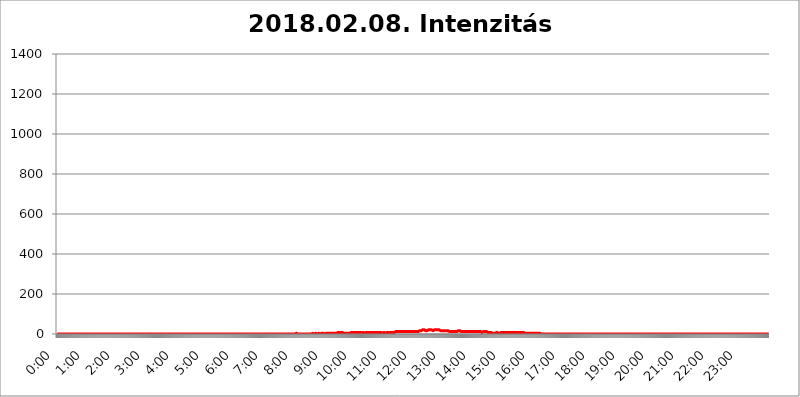
| Category | 2018.02.08. Intenzitás [W/m^2] |
|---|---|
| 0.0 | 0 |
| 0.0006944444444444445 | 0 |
| 0.001388888888888889 | 0 |
| 0.0020833333333333333 | 0 |
| 0.002777777777777778 | 0 |
| 0.003472222222222222 | 0 |
| 0.004166666666666667 | 0 |
| 0.004861111111111111 | 0 |
| 0.005555555555555556 | 0 |
| 0.0062499999999999995 | 0 |
| 0.006944444444444444 | 0 |
| 0.007638888888888889 | 0 |
| 0.008333333333333333 | 0 |
| 0.009027777777777779 | 0 |
| 0.009722222222222222 | 0 |
| 0.010416666666666666 | 0 |
| 0.011111111111111112 | 0 |
| 0.011805555555555555 | 0 |
| 0.012499999999999999 | 0 |
| 0.013194444444444444 | 0 |
| 0.013888888888888888 | 0 |
| 0.014583333333333332 | 0 |
| 0.015277777777777777 | 0 |
| 0.015972222222222224 | 0 |
| 0.016666666666666666 | 0 |
| 0.017361111111111112 | 0 |
| 0.018055555555555557 | 0 |
| 0.01875 | 0 |
| 0.019444444444444445 | 0 |
| 0.02013888888888889 | 0 |
| 0.020833333333333332 | 0 |
| 0.02152777777777778 | 0 |
| 0.022222222222222223 | 0 |
| 0.02291666666666667 | 0 |
| 0.02361111111111111 | 0 |
| 0.024305555555555556 | 0 |
| 0.024999999999999998 | 0 |
| 0.025694444444444447 | 0 |
| 0.02638888888888889 | 0 |
| 0.027083333333333334 | 0 |
| 0.027777777777777776 | 0 |
| 0.02847222222222222 | 0 |
| 0.029166666666666664 | 0 |
| 0.029861111111111113 | 0 |
| 0.030555555555555555 | 0 |
| 0.03125 | 0 |
| 0.03194444444444445 | 0 |
| 0.03263888888888889 | 0 |
| 0.03333333333333333 | 0 |
| 0.034027777777777775 | 0 |
| 0.034722222222222224 | 0 |
| 0.035416666666666666 | 0 |
| 0.036111111111111115 | 0 |
| 0.03680555555555556 | 0 |
| 0.0375 | 0 |
| 0.03819444444444444 | 0 |
| 0.03888888888888889 | 0 |
| 0.03958333333333333 | 0 |
| 0.04027777777777778 | 0 |
| 0.04097222222222222 | 0 |
| 0.041666666666666664 | 0 |
| 0.042361111111111106 | 0 |
| 0.04305555555555556 | 0 |
| 0.043750000000000004 | 0 |
| 0.044444444444444446 | 0 |
| 0.04513888888888889 | 0 |
| 0.04583333333333334 | 0 |
| 0.04652777777777778 | 0 |
| 0.04722222222222222 | 0 |
| 0.04791666666666666 | 0 |
| 0.04861111111111111 | 0 |
| 0.049305555555555554 | 0 |
| 0.049999999999999996 | 0 |
| 0.05069444444444445 | 0 |
| 0.051388888888888894 | 0 |
| 0.052083333333333336 | 0 |
| 0.05277777777777778 | 0 |
| 0.05347222222222222 | 0 |
| 0.05416666666666667 | 0 |
| 0.05486111111111111 | 0 |
| 0.05555555555555555 | 0 |
| 0.05625 | 0 |
| 0.05694444444444444 | 0 |
| 0.057638888888888885 | 0 |
| 0.05833333333333333 | 0 |
| 0.05902777777777778 | 0 |
| 0.059722222222222225 | 0 |
| 0.06041666666666667 | 0 |
| 0.061111111111111116 | 0 |
| 0.06180555555555556 | 0 |
| 0.0625 | 0 |
| 0.06319444444444444 | 0 |
| 0.06388888888888888 | 0 |
| 0.06458333333333334 | 0 |
| 0.06527777777777778 | 0 |
| 0.06597222222222222 | 0 |
| 0.06666666666666667 | 0 |
| 0.06736111111111111 | 0 |
| 0.06805555555555555 | 0 |
| 0.06874999999999999 | 0 |
| 0.06944444444444443 | 0 |
| 0.07013888888888889 | 0 |
| 0.07083333333333333 | 0 |
| 0.07152777777777779 | 0 |
| 0.07222222222222223 | 0 |
| 0.07291666666666667 | 0 |
| 0.07361111111111111 | 0 |
| 0.07430555555555556 | 0 |
| 0.075 | 0 |
| 0.07569444444444444 | 0 |
| 0.0763888888888889 | 0 |
| 0.07708333333333334 | 0 |
| 0.07777777777777778 | 0 |
| 0.07847222222222222 | 0 |
| 0.07916666666666666 | 0 |
| 0.0798611111111111 | 0 |
| 0.08055555555555556 | 0 |
| 0.08125 | 0 |
| 0.08194444444444444 | 0 |
| 0.08263888888888889 | 0 |
| 0.08333333333333333 | 0 |
| 0.08402777777777777 | 0 |
| 0.08472222222222221 | 0 |
| 0.08541666666666665 | 0 |
| 0.08611111111111112 | 0 |
| 0.08680555555555557 | 0 |
| 0.08750000000000001 | 0 |
| 0.08819444444444445 | 0 |
| 0.08888888888888889 | 0 |
| 0.08958333333333333 | 0 |
| 0.09027777777777778 | 0 |
| 0.09097222222222222 | 0 |
| 0.09166666666666667 | 0 |
| 0.09236111111111112 | 0 |
| 0.09305555555555556 | 0 |
| 0.09375 | 0 |
| 0.09444444444444444 | 0 |
| 0.09513888888888888 | 0 |
| 0.09583333333333333 | 0 |
| 0.09652777777777777 | 0 |
| 0.09722222222222222 | 0 |
| 0.09791666666666667 | 0 |
| 0.09861111111111111 | 0 |
| 0.09930555555555555 | 0 |
| 0.09999999999999999 | 0 |
| 0.10069444444444443 | 0 |
| 0.1013888888888889 | 0 |
| 0.10208333333333335 | 0 |
| 0.10277777777777779 | 0 |
| 0.10347222222222223 | 0 |
| 0.10416666666666667 | 0 |
| 0.10486111111111111 | 0 |
| 0.10555555555555556 | 0 |
| 0.10625 | 0 |
| 0.10694444444444444 | 0 |
| 0.1076388888888889 | 0 |
| 0.10833333333333334 | 0 |
| 0.10902777777777778 | 0 |
| 0.10972222222222222 | 0 |
| 0.1111111111111111 | 0 |
| 0.11180555555555556 | 0 |
| 0.11180555555555556 | 0 |
| 0.1125 | 0 |
| 0.11319444444444444 | 0 |
| 0.11388888888888889 | 0 |
| 0.11458333333333333 | 0 |
| 0.11527777777777777 | 0 |
| 0.11597222222222221 | 0 |
| 0.11666666666666665 | 0 |
| 0.1173611111111111 | 0 |
| 0.11805555555555557 | 0 |
| 0.11944444444444445 | 0 |
| 0.12013888888888889 | 0 |
| 0.12083333333333333 | 0 |
| 0.12152777777777778 | 0 |
| 0.12222222222222223 | 0 |
| 0.12291666666666667 | 0 |
| 0.12291666666666667 | 0 |
| 0.12361111111111112 | 0 |
| 0.12430555555555556 | 0 |
| 0.125 | 0 |
| 0.12569444444444444 | 0 |
| 0.12638888888888888 | 0 |
| 0.12708333333333333 | 0 |
| 0.16875 | 0 |
| 0.12847222222222224 | 0 |
| 0.12916666666666668 | 0 |
| 0.12986111111111112 | 0 |
| 0.13055555555555556 | 0 |
| 0.13125 | 0 |
| 0.13194444444444445 | 0 |
| 0.1326388888888889 | 0 |
| 0.13333333333333333 | 0 |
| 0.13402777777777777 | 0 |
| 0.13402777777777777 | 0 |
| 0.13472222222222222 | 0 |
| 0.13541666666666666 | 0 |
| 0.1361111111111111 | 0 |
| 0.13749999999999998 | 0 |
| 0.13819444444444443 | 0 |
| 0.1388888888888889 | 0 |
| 0.13958333333333334 | 0 |
| 0.14027777777777778 | 0 |
| 0.14097222222222222 | 0 |
| 0.14166666666666666 | 0 |
| 0.1423611111111111 | 0 |
| 0.14305555555555557 | 0 |
| 0.14375000000000002 | 0 |
| 0.14444444444444446 | 0 |
| 0.1451388888888889 | 0 |
| 0.1451388888888889 | 0 |
| 0.14652777777777778 | 0 |
| 0.14722222222222223 | 0 |
| 0.14791666666666667 | 0 |
| 0.1486111111111111 | 0 |
| 0.14930555555555555 | 0 |
| 0.15 | 0 |
| 0.15069444444444444 | 0 |
| 0.15138888888888888 | 0 |
| 0.15208333333333332 | 0 |
| 0.15277777777777776 | 0 |
| 0.15347222222222223 | 0 |
| 0.15416666666666667 | 0 |
| 0.15486111111111112 | 0 |
| 0.15555555555555556 | 0 |
| 0.15625 | 0 |
| 0.15694444444444444 | 0 |
| 0.15763888888888888 | 0 |
| 0.15833333333333333 | 0 |
| 0.15902777777777777 | 0 |
| 0.15972222222222224 | 0 |
| 0.16041666666666668 | 0 |
| 0.16111111111111112 | 0 |
| 0.16180555555555556 | 0 |
| 0.1625 | 0 |
| 0.16319444444444445 | 0 |
| 0.1638888888888889 | 0 |
| 0.16458333333333333 | 0 |
| 0.16527777777777777 | 0 |
| 0.16597222222222222 | 0 |
| 0.16666666666666666 | 0 |
| 0.1673611111111111 | 0 |
| 0.16805555555555554 | 0 |
| 0.16874999999999998 | 0 |
| 0.16944444444444443 | 0 |
| 0.17013888888888887 | 0 |
| 0.1708333333333333 | 0 |
| 0.17152777777777775 | 0 |
| 0.17222222222222225 | 0 |
| 0.1729166666666667 | 0 |
| 0.17361111111111113 | 0 |
| 0.17430555555555557 | 0 |
| 0.17500000000000002 | 0 |
| 0.17569444444444446 | 0 |
| 0.1763888888888889 | 0 |
| 0.17708333333333334 | 0 |
| 0.17777777777777778 | 0 |
| 0.17847222222222223 | 0 |
| 0.17916666666666667 | 0 |
| 0.1798611111111111 | 0 |
| 0.18055555555555555 | 0 |
| 0.18125 | 0 |
| 0.18194444444444444 | 0 |
| 0.1826388888888889 | 0 |
| 0.18333333333333335 | 0 |
| 0.1840277777777778 | 0 |
| 0.18472222222222223 | 0 |
| 0.18541666666666667 | 0 |
| 0.18611111111111112 | 0 |
| 0.18680555555555556 | 0 |
| 0.1875 | 0 |
| 0.18819444444444444 | 0 |
| 0.18888888888888888 | 0 |
| 0.18958333333333333 | 0 |
| 0.19027777777777777 | 0 |
| 0.1909722222222222 | 0 |
| 0.19166666666666665 | 0 |
| 0.19236111111111112 | 0 |
| 0.19305555555555554 | 0 |
| 0.19375 | 0 |
| 0.19444444444444445 | 0 |
| 0.1951388888888889 | 0 |
| 0.19583333333333333 | 0 |
| 0.19652777777777777 | 0 |
| 0.19722222222222222 | 0 |
| 0.19791666666666666 | 0 |
| 0.1986111111111111 | 0 |
| 0.19930555555555554 | 0 |
| 0.19999999999999998 | 0 |
| 0.20069444444444443 | 0 |
| 0.20138888888888887 | 0 |
| 0.2020833333333333 | 0 |
| 0.2027777777777778 | 0 |
| 0.2034722222222222 | 0 |
| 0.2041666666666667 | 0 |
| 0.20486111111111113 | 0 |
| 0.20555555555555557 | 0 |
| 0.20625000000000002 | 0 |
| 0.20694444444444446 | 0 |
| 0.2076388888888889 | 0 |
| 0.20833333333333334 | 0 |
| 0.20902777777777778 | 0 |
| 0.20972222222222223 | 0 |
| 0.21041666666666667 | 0 |
| 0.2111111111111111 | 0 |
| 0.21180555555555555 | 0 |
| 0.2125 | 0 |
| 0.21319444444444444 | 0 |
| 0.2138888888888889 | 0 |
| 0.21458333333333335 | 0 |
| 0.2152777777777778 | 0 |
| 0.21597222222222223 | 0 |
| 0.21666666666666667 | 0 |
| 0.21736111111111112 | 0 |
| 0.21805555555555556 | 0 |
| 0.21875 | 0 |
| 0.21944444444444444 | 0 |
| 0.22013888888888888 | 0 |
| 0.22083333333333333 | 0 |
| 0.22152777777777777 | 0 |
| 0.2222222222222222 | 0 |
| 0.22291666666666665 | 0 |
| 0.2236111111111111 | 0 |
| 0.22430555555555556 | 0 |
| 0.225 | 0 |
| 0.22569444444444445 | 0 |
| 0.2263888888888889 | 0 |
| 0.22708333333333333 | 0 |
| 0.22777777777777777 | 0 |
| 0.22847222222222222 | 0 |
| 0.22916666666666666 | 0 |
| 0.2298611111111111 | 0 |
| 0.23055555555555554 | 0 |
| 0.23124999999999998 | 0 |
| 0.23194444444444443 | 0 |
| 0.23263888888888887 | 0 |
| 0.2333333333333333 | 0 |
| 0.2340277777777778 | 0 |
| 0.2347222222222222 | 0 |
| 0.2354166666666667 | 0 |
| 0.23611111111111113 | 0 |
| 0.23680555555555557 | 0 |
| 0.23750000000000002 | 0 |
| 0.23819444444444446 | 0 |
| 0.2388888888888889 | 0 |
| 0.23958333333333334 | 0 |
| 0.24027777777777778 | 0 |
| 0.24097222222222223 | 0 |
| 0.24166666666666667 | 0 |
| 0.2423611111111111 | 0 |
| 0.24305555555555555 | 0 |
| 0.24375 | 0 |
| 0.24444444444444446 | 0 |
| 0.24513888888888888 | 0 |
| 0.24583333333333335 | 0 |
| 0.2465277777777778 | 0 |
| 0.24722222222222223 | 0 |
| 0.24791666666666667 | 0 |
| 0.24861111111111112 | 0 |
| 0.24930555555555556 | 0 |
| 0.25 | 0 |
| 0.25069444444444444 | 0 |
| 0.2513888888888889 | 0 |
| 0.2520833333333333 | 0 |
| 0.25277777777777777 | 0 |
| 0.2534722222222222 | 0 |
| 0.25416666666666665 | 0 |
| 0.2548611111111111 | 0 |
| 0.2555555555555556 | 0 |
| 0.25625000000000003 | 0 |
| 0.2569444444444445 | 0 |
| 0.2576388888888889 | 0 |
| 0.25833333333333336 | 0 |
| 0.2590277777777778 | 0 |
| 0.25972222222222224 | 0 |
| 0.2604166666666667 | 0 |
| 0.2611111111111111 | 0 |
| 0.26180555555555557 | 0 |
| 0.2625 | 0 |
| 0.26319444444444445 | 0 |
| 0.2638888888888889 | 0 |
| 0.26458333333333334 | 0 |
| 0.2652777777777778 | 0 |
| 0.2659722222222222 | 0 |
| 0.26666666666666666 | 0 |
| 0.2673611111111111 | 0 |
| 0.26805555555555555 | 0 |
| 0.26875 | 0 |
| 0.26944444444444443 | 0 |
| 0.2701388888888889 | 0 |
| 0.2708333333333333 | 0 |
| 0.27152777777777776 | 0 |
| 0.2722222222222222 | 0 |
| 0.27291666666666664 | 0 |
| 0.2736111111111111 | 0 |
| 0.2743055555555555 | 0 |
| 0.27499999999999997 | 0 |
| 0.27569444444444446 | 0 |
| 0.27638888888888885 | 0 |
| 0.27708333333333335 | 0 |
| 0.2777777777777778 | 0 |
| 0.27847222222222223 | 0 |
| 0.2791666666666667 | 0 |
| 0.2798611111111111 | 0 |
| 0.28055555555555556 | 0 |
| 0.28125 | 0 |
| 0.28194444444444444 | 0 |
| 0.2826388888888889 | 0 |
| 0.2833333333333333 | 0 |
| 0.28402777777777777 | 0 |
| 0.2847222222222222 | 0 |
| 0.28541666666666665 | 0 |
| 0.28611111111111115 | 0 |
| 0.28680555555555554 | 0 |
| 0.28750000000000003 | 0 |
| 0.2881944444444445 | 0 |
| 0.2888888888888889 | 0 |
| 0.28958333333333336 | 0 |
| 0.2902777777777778 | 0 |
| 0.29097222222222224 | 0 |
| 0.2916666666666667 | 0 |
| 0.2923611111111111 | 0 |
| 0.29305555555555557 | 0 |
| 0.29375 | 0 |
| 0.29444444444444445 | 0 |
| 0.2951388888888889 | 0 |
| 0.29583333333333334 | 0 |
| 0.2965277777777778 | 0 |
| 0.2972222222222222 | 0 |
| 0.29791666666666666 | 0 |
| 0.2986111111111111 | 0 |
| 0.29930555555555555 | 0 |
| 0.3 | 0 |
| 0.30069444444444443 | 0 |
| 0.3013888888888889 | 0 |
| 0.3020833333333333 | 0 |
| 0.30277777777777776 | 0 |
| 0.3034722222222222 | 0 |
| 0.30416666666666664 | 0 |
| 0.3048611111111111 | 0 |
| 0.3055555555555555 | 0 |
| 0.30624999999999997 | 0 |
| 0.3069444444444444 | 0 |
| 0.3076388888888889 | 0 |
| 0.30833333333333335 | 0 |
| 0.3090277777777778 | 0 |
| 0.30972222222222223 | 0 |
| 0.3104166666666667 | 0 |
| 0.3111111111111111 | 0 |
| 0.31180555555555556 | 0 |
| 0.3125 | 0 |
| 0.31319444444444444 | 0 |
| 0.3138888888888889 | 0 |
| 0.3145833333333333 | 0 |
| 0.31527777777777777 | 0 |
| 0.3159722222222222 | 0 |
| 0.31666666666666665 | 0 |
| 0.31736111111111115 | 0 |
| 0.31805555555555554 | 0 |
| 0.31875000000000003 | 0 |
| 0.3194444444444445 | 0 |
| 0.3201388888888889 | 0 |
| 0.32083333333333336 | 0 |
| 0.3215277777777778 | 0 |
| 0.32222222222222224 | 0 |
| 0.3229166666666667 | 0 |
| 0.3236111111111111 | 0 |
| 0.32430555555555557 | 0 |
| 0.325 | 0 |
| 0.32569444444444445 | 0 |
| 0.3263888888888889 | 0 |
| 0.32708333333333334 | 0 |
| 0.3277777777777778 | 0 |
| 0.3284722222222222 | 0 |
| 0.32916666666666666 | 0 |
| 0.3298611111111111 | 0 |
| 0.33055555555555555 | 0 |
| 0.33125 | 0 |
| 0.33194444444444443 | 0 |
| 0.3326388888888889 | 0 |
| 0.3333333333333333 | 0 |
| 0.3340277777777778 | 0 |
| 0.3347222222222222 | 3.525 |
| 0.3354166666666667 | 3.525 |
| 0.3361111111111111 | 0 |
| 0.3368055555555556 | 0 |
| 0.33749999999999997 | 0 |
| 0.33819444444444446 | 0 |
| 0.33888888888888885 | 0 |
| 0.33958333333333335 | 0 |
| 0.34027777777777773 | 0 |
| 0.34097222222222223 | 0 |
| 0.3416666666666666 | 0 |
| 0.3423611111111111 | 0 |
| 0.3430555555555555 | 0 |
| 0.34375 | 0 |
| 0.3444444444444445 | 0 |
| 0.3451388888888889 | 0 |
| 0.3458333333333334 | 0 |
| 0.34652777777777777 | 0 |
| 0.34722222222222227 | 0 |
| 0.34791666666666665 | 0 |
| 0.34861111111111115 | 0 |
| 0.34930555555555554 | 0 |
| 0.35000000000000003 | 0 |
| 0.3506944444444444 | 0 |
| 0.3513888888888889 | 0 |
| 0.3520833333333333 | 0 |
| 0.3527777777777778 | 0 |
| 0.3534722222222222 | 0 |
| 0.3541666666666667 | 0 |
| 0.3548611111111111 | 0 |
| 0.35555555555555557 | 0 |
| 0.35625 | 0 |
| 0.35694444444444445 | 0 |
| 0.3576388888888889 | 0 |
| 0.35833333333333334 | 3.525 |
| 0.3590277777777778 | 0 |
| 0.3597222222222222 | 0 |
| 0.36041666666666666 | 0 |
| 0.3611111111111111 | 0 |
| 0.36180555555555555 | 3.525 |
| 0.3625 | 3.525 |
| 0.36319444444444443 | 3.525 |
| 0.3638888888888889 | 0 |
| 0.3645833333333333 | 0 |
| 0.3652777777777778 | 0 |
| 0.3659722222222222 | 3.525 |
| 0.3666666666666667 | 3.525 |
| 0.3673611111111111 | 3.525 |
| 0.3680555555555556 | 0 |
| 0.36874999999999997 | 0 |
| 0.36944444444444446 | 0 |
| 0.37013888888888885 | 0 |
| 0.37083333333333335 | 3.525 |
| 0.37152777777777773 | 3.525 |
| 0.37222222222222223 | 0 |
| 0.3729166666666666 | 3.525 |
| 0.3736111111111111 | 3.525 |
| 0.3743055555555555 | 3.525 |
| 0.375 | 0 |
| 0.3756944444444445 | 3.525 |
| 0.3763888888888889 | 0 |
| 0.3770833333333334 | 3.525 |
| 0.37777777777777777 | 3.525 |
| 0.37847222222222227 | 3.525 |
| 0.37916666666666665 | 3.525 |
| 0.37986111111111115 | 3.525 |
| 0.38055555555555554 | 3.525 |
| 0.38125000000000003 | 3.525 |
| 0.3819444444444444 | 3.525 |
| 0.3826388888888889 | 3.525 |
| 0.3833333333333333 | 3.525 |
| 0.3840277777777778 | 3.525 |
| 0.3847222222222222 | 3.525 |
| 0.3854166666666667 | 3.525 |
| 0.3861111111111111 | 3.525 |
| 0.38680555555555557 | 3.525 |
| 0.3875 | 3.525 |
| 0.38819444444444445 | 3.525 |
| 0.3888888888888889 | 3.525 |
| 0.38958333333333334 | 3.525 |
| 0.3902777777777778 | 3.525 |
| 0.3909722222222222 | 3.525 |
| 0.39166666666666666 | 3.525 |
| 0.3923611111111111 | 3.525 |
| 0.39305555555555555 | 7.887 |
| 0.39375 | 7.887 |
| 0.39444444444444443 | 3.525 |
| 0.3951388888888889 | 3.525 |
| 0.3958333333333333 | 7.887 |
| 0.3965277777777778 | 7.887 |
| 0.3972222222222222 | 7.887 |
| 0.3979166666666667 | 7.887 |
| 0.3986111111111111 | 7.887 |
| 0.3993055555555556 | 7.887 |
| 0.39999999999999997 | 7.887 |
| 0.40069444444444446 | 7.887 |
| 0.40138888888888885 | 7.887 |
| 0.40208333333333335 | 3.525 |
| 0.40277777777777773 | 7.887 |
| 0.40347222222222223 | 7.887 |
| 0.4041666666666666 | 3.525 |
| 0.4048611111111111 | 7.887 |
| 0.4055555555555555 | 3.525 |
| 0.40625 | 3.525 |
| 0.4069444444444445 | 3.525 |
| 0.4076388888888889 | 3.525 |
| 0.4083333333333334 | 3.525 |
| 0.40902777777777777 | 3.525 |
| 0.40972222222222227 | 3.525 |
| 0.41041666666666665 | 3.525 |
| 0.41111111111111115 | 3.525 |
| 0.41180555555555554 | 3.525 |
| 0.41250000000000003 | 7.887 |
| 0.4131944444444444 | 3.525 |
| 0.4138888888888889 | 7.887 |
| 0.4145833333333333 | 7.887 |
| 0.4152777777777778 | 7.887 |
| 0.4159722222222222 | 7.887 |
| 0.4166666666666667 | 7.887 |
| 0.4173611111111111 | 7.887 |
| 0.41805555555555557 | 7.887 |
| 0.41875 | 7.887 |
| 0.41944444444444445 | 7.887 |
| 0.4201388888888889 | 7.887 |
| 0.42083333333333334 | 7.887 |
| 0.4215277777777778 | 7.887 |
| 0.4222222222222222 | 7.887 |
| 0.42291666666666666 | 7.887 |
| 0.4236111111111111 | 7.887 |
| 0.42430555555555555 | 7.887 |
| 0.425 | 7.887 |
| 0.42569444444444443 | 7.887 |
| 0.4263888888888889 | 7.887 |
| 0.4270833333333333 | 7.887 |
| 0.4277777777777778 | 7.887 |
| 0.4284722222222222 | 7.887 |
| 0.4291666666666667 | 7.887 |
| 0.4298611111111111 | 7.887 |
| 0.4305555555555556 | 3.525 |
| 0.43124999999999997 | 3.525 |
| 0.43194444444444446 | 7.887 |
| 0.43263888888888885 | 7.887 |
| 0.43333333333333335 | 7.887 |
| 0.43402777777777773 | 7.887 |
| 0.43472222222222223 | 7.887 |
| 0.4354166666666666 | 7.887 |
| 0.4361111111111111 | 7.887 |
| 0.4368055555555555 | 7.887 |
| 0.4375 | 7.887 |
| 0.4381944444444445 | 7.887 |
| 0.4388888888888889 | 7.887 |
| 0.4395833333333334 | 7.887 |
| 0.44027777777777777 | 7.887 |
| 0.44097222222222227 | 7.887 |
| 0.44166666666666665 | 7.887 |
| 0.44236111111111115 | 7.887 |
| 0.44305555555555554 | 7.887 |
| 0.44375000000000003 | 7.887 |
| 0.4444444444444444 | 7.887 |
| 0.4451388888888889 | 7.887 |
| 0.4458333333333333 | 7.887 |
| 0.4465277777777778 | 7.887 |
| 0.4472222222222222 | 7.887 |
| 0.4479166666666667 | 7.887 |
| 0.4486111111111111 | 7.887 |
| 0.44930555555555557 | 7.887 |
| 0.45 | 7.887 |
| 0.45069444444444445 | 7.887 |
| 0.4513888888888889 | 7.887 |
| 0.45208333333333334 | 7.887 |
| 0.4527777777777778 | 7.887 |
| 0.4534722222222222 | 7.887 |
| 0.45416666666666666 | 7.887 |
| 0.4548611111111111 | 7.887 |
| 0.45555555555555555 | 7.887 |
| 0.45625 | 3.525 |
| 0.45694444444444443 | 7.887 |
| 0.4576388888888889 | 3.525 |
| 0.4583333333333333 | 7.887 |
| 0.4590277777777778 | 7.887 |
| 0.4597222222222222 | 3.525 |
| 0.4604166666666667 | 3.525 |
| 0.4611111111111111 | 7.887 |
| 0.4618055555555556 | 7.887 |
| 0.46249999999999997 | 7.887 |
| 0.46319444444444446 | 7.887 |
| 0.46388888888888885 | 7.887 |
| 0.46458333333333335 | 7.887 |
| 0.46527777777777773 | 7.887 |
| 0.46597222222222223 | 7.887 |
| 0.4666666666666666 | 7.887 |
| 0.4673611111111111 | 7.887 |
| 0.4680555555555555 | 7.887 |
| 0.46875 | 7.887 |
| 0.4694444444444445 | 7.887 |
| 0.4701388888888889 | 7.887 |
| 0.4708333333333334 | 7.887 |
| 0.47152777777777777 | 7.887 |
| 0.47222222222222227 | 7.887 |
| 0.47291666666666665 | 7.887 |
| 0.47361111111111115 | 7.887 |
| 0.47430555555555554 | 7.887 |
| 0.47500000000000003 | 12.257 |
| 0.4756944444444444 | 12.257 |
| 0.4763888888888889 | 12.257 |
| 0.4770833333333333 | 12.257 |
| 0.4777777777777778 | 12.257 |
| 0.4784722222222222 | 12.257 |
| 0.4791666666666667 | 12.257 |
| 0.4798611111111111 | 12.257 |
| 0.48055555555555557 | 12.257 |
| 0.48125 | 12.257 |
| 0.48194444444444445 | 12.257 |
| 0.4826388888888889 | 12.257 |
| 0.48333333333333334 | 12.257 |
| 0.4840277777777778 | 12.257 |
| 0.4847222222222222 | 12.257 |
| 0.48541666666666666 | 12.257 |
| 0.4861111111111111 | 12.257 |
| 0.48680555555555555 | 12.257 |
| 0.4875 | 12.257 |
| 0.48819444444444443 | 12.257 |
| 0.4888888888888889 | 12.257 |
| 0.4895833333333333 | 12.257 |
| 0.4902777777777778 | 12.257 |
| 0.4909722222222222 | 12.257 |
| 0.4916666666666667 | 12.257 |
| 0.4923611111111111 | 12.257 |
| 0.4930555555555556 | 12.257 |
| 0.49374999999999997 | 12.257 |
| 0.49444444444444446 | 12.257 |
| 0.49513888888888885 | 12.257 |
| 0.49583333333333335 | 12.257 |
| 0.49652777777777773 | 12.257 |
| 0.49722222222222223 | 12.257 |
| 0.4979166666666666 | 12.257 |
| 0.4986111111111111 | 12.257 |
| 0.4993055555555555 | 12.257 |
| 0.5 | 12.257 |
| 0.5006944444444444 | 16.636 |
| 0.5013888888888889 | 12.257 |
| 0.5020833333333333 | 12.257 |
| 0.5027777777777778 | 12.257 |
| 0.5034722222222222 | 12.257 |
| 0.5041666666666667 | 12.257 |
| 0.5048611111111111 | 12.257 |
| 0.5055555555555555 | 12.257 |
| 0.50625 | 12.257 |
| 0.5069444444444444 | 12.257 |
| 0.5076388888888889 | 16.636 |
| 0.5083333333333333 | 16.636 |
| 0.5090277777777777 | 16.636 |
| 0.5097222222222222 | 16.636 |
| 0.5104166666666666 | 16.636 |
| 0.5111111111111112 | 21.024 |
| 0.5118055555555555 | 21.024 |
| 0.5125000000000001 | 21.024 |
| 0.5131944444444444 | 21.024 |
| 0.513888888888889 | 21.024 |
| 0.5145833333333333 | 21.024 |
| 0.5152777777777778 | 21.024 |
| 0.5159722222222222 | 16.636 |
| 0.5166666666666667 | 16.636 |
| 0.517361111111111 | 16.636 |
| 0.5180555555555556 | 16.636 |
| 0.5187499999999999 | 16.636 |
| 0.5194444444444445 | 21.024 |
| 0.5201388888888888 | 21.024 |
| 0.5208333333333334 | 21.024 |
| 0.5215277777777778 | 21.024 |
| 0.5222222222222223 | 21.024 |
| 0.5229166666666667 | 21.024 |
| 0.5236111111111111 | 21.024 |
| 0.5243055555555556 | 21.024 |
| 0.525 | 21.024 |
| 0.5256944444444445 | 21.024 |
| 0.5263888888888889 | 21.024 |
| 0.5270833333333333 | 16.636 |
| 0.5277777777777778 | 16.636 |
| 0.5284722222222222 | 16.636 |
| 0.5291666666666667 | 21.024 |
| 0.5298611111111111 | 21.024 |
| 0.5305555555555556 | 21.024 |
| 0.53125 | 21.024 |
| 0.5319444444444444 | 21.024 |
| 0.5326388888888889 | 21.024 |
| 0.5333333333333333 | 21.024 |
| 0.5340277777777778 | 21.024 |
| 0.5347222222222222 | 21.024 |
| 0.5354166666666667 | 21.024 |
| 0.5361111111111111 | 16.636 |
| 0.5368055555555555 | 16.636 |
| 0.5375 | 16.636 |
| 0.5381944444444444 | 16.636 |
| 0.5388888888888889 | 12.257 |
| 0.5395833333333333 | 16.636 |
| 0.5402777777777777 | 12.257 |
| 0.5409722222222222 | 12.257 |
| 0.5416666666666666 | 16.636 |
| 0.5423611111111112 | 16.636 |
| 0.5430555555555555 | 16.636 |
| 0.5437500000000001 | 16.636 |
| 0.5444444444444444 | 16.636 |
| 0.545138888888889 | 16.636 |
| 0.5458333333333333 | 16.636 |
| 0.5465277777777778 | 16.636 |
| 0.5472222222222222 | 16.636 |
| 0.5479166666666667 | 16.636 |
| 0.548611111111111 | 16.636 |
| 0.5493055555555556 | 12.257 |
| 0.5499999999999999 | 12.257 |
| 0.5506944444444445 | 12.257 |
| 0.5513888888888888 | 12.257 |
| 0.5520833333333334 | 12.257 |
| 0.5527777777777778 | 12.257 |
| 0.5534722222222223 | 12.257 |
| 0.5541666666666667 | 12.257 |
| 0.5548611111111111 | 12.257 |
| 0.5555555555555556 | 12.257 |
| 0.55625 | 12.257 |
| 0.5569444444444445 | 12.257 |
| 0.5576388888888889 | 12.257 |
| 0.5583333333333333 | 12.257 |
| 0.5590277777777778 | 12.257 |
| 0.5597222222222222 | 12.257 |
| 0.5604166666666667 | 12.257 |
| 0.5611111111111111 | 12.257 |
| 0.5618055555555556 | 16.636 |
| 0.5625 | 16.636 |
| 0.5631944444444444 | 16.636 |
| 0.5638888888888889 | 16.636 |
| 0.5645833333333333 | 16.636 |
| 0.5652777777777778 | 16.636 |
| 0.5659722222222222 | 12.257 |
| 0.5666666666666667 | 12.257 |
| 0.5673611111111111 | 12.257 |
| 0.5680555555555555 | 12.257 |
| 0.56875 | 12.257 |
| 0.5694444444444444 | 12.257 |
| 0.5701388888888889 | 12.257 |
| 0.5708333333333333 | 12.257 |
| 0.5715277777777777 | 12.257 |
| 0.5722222222222222 | 12.257 |
| 0.5729166666666666 | 12.257 |
| 0.5736111111111112 | 12.257 |
| 0.5743055555555555 | 12.257 |
| 0.5750000000000001 | 12.257 |
| 0.5756944444444444 | 12.257 |
| 0.576388888888889 | 12.257 |
| 0.5770833333333333 | 12.257 |
| 0.5777777777777778 | 12.257 |
| 0.5784722222222222 | 12.257 |
| 0.5791666666666667 | 12.257 |
| 0.579861111111111 | 12.257 |
| 0.5805555555555556 | 12.257 |
| 0.5812499999999999 | 12.257 |
| 0.5819444444444445 | 12.257 |
| 0.5826388888888888 | 12.257 |
| 0.5833333333333334 | 12.257 |
| 0.5840277777777778 | 12.257 |
| 0.5847222222222223 | 12.257 |
| 0.5854166666666667 | 12.257 |
| 0.5861111111111111 | 12.257 |
| 0.5868055555555556 | 12.257 |
| 0.5875 | 12.257 |
| 0.5881944444444445 | 12.257 |
| 0.5888888888888889 | 12.257 |
| 0.5895833333333333 | 12.257 |
| 0.5902777777777778 | 12.257 |
| 0.5909722222222222 | 12.257 |
| 0.5916666666666667 | 12.257 |
| 0.5923611111111111 | 12.257 |
| 0.5930555555555556 | 12.257 |
| 0.59375 | 12.257 |
| 0.5944444444444444 | 12.257 |
| 0.5951388888888889 | 7.887 |
| 0.5958333333333333 | 7.887 |
| 0.5965277777777778 | 12.257 |
| 0.5972222222222222 | 12.257 |
| 0.5979166666666667 | 12.257 |
| 0.5986111111111111 | 12.257 |
| 0.5993055555555555 | 12.257 |
| 0.6 | 12.257 |
| 0.6006944444444444 | 12.257 |
| 0.6013888888888889 | 12.257 |
| 0.6020833333333333 | 12.257 |
| 0.6027777777777777 | 12.257 |
| 0.6034722222222222 | 7.887 |
| 0.6041666666666666 | 7.887 |
| 0.6048611111111112 | 7.887 |
| 0.6055555555555555 | 7.887 |
| 0.6062500000000001 | 7.887 |
| 0.6069444444444444 | 7.887 |
| 0.607638888888889 | 7.887 |
| 0.6083333333333333 | 7.887 |
| 0.6090277777777778 | 7.887 |
| 0.6097222222222222 | 7.887 |
| 0.6104166666666667 | 3.525 |
| 0.611111111111111 | 3.525 |
| 0.6118055555555556 | 3.525 |
| 0.6124999999999999 | 3.525 |
| 0.6131944444444445 | 3.525 |
| 0.6138888888888888 | 3.525 |
| 0.6145833333333334 | 3.525 |
| 0.6152777777777778 | 7.887 |
| 0.6159722222222223 | 3.525 |
| 0.6166666666666667 | 7.887 |
| 0.6173611111111111 | 7.887 |
| 0.6180555555555556 | 3.525 |
| 0.61875 | 3.525 |
| 0.6194444444444445 | 3.525 |
| 0.6201388888888889 | 7.887 |
| 0.6208333333333333 | 3.525 |
| 0.6215277777777778 | 3.525 |
| 0.6222222222222222 | 7.887 |
| 0.6229166666666667 | 7.887 |
| 0.6236111111111111 | 7.887 |
| 0.6243055555555556 | 7.887 |
| 0.625 | 7.887 |
| 0.6256944444444444 | 7.887 |
| 0.6263888888888889 | 7.887 |
| 0.6270833333333333 | 7.887 |
| 0.6277777777777778 | 7.887 |
| 0.6284722222222222 | 7.887 |
| 0.6291666666666667 | 7.887 |
| 0.6298611111111111 | 7.887 |
| 0.6305555555555555 | 7.887 |
| 0.63125 | 7.887 |
| 0.6319444444444444 | 7.887 |
| 0.6326388888888889 | 7.887 |
| 0.6333333333333333 | 7.887 |
| 0.6340277777777777 | 7.887 |
| 0.6347222222222222 | 3.525 |
| 0.6354166666666666 | 7.887 |
| 0.6361111111111112 | 3.525 |
| 0.6368055555555555 | 7.887 |
| 0.6375000000000001 | 7.887 |
| 0.6381944444444444 | 7.887 |
| 0.638888888888889 | 3.525 |
| 0.6395833333333333 | 7.887 |
| 0.6402777777777778 | 7.887 |
| 0.6409722222222222 | 7.887 |
| 0.6416666666666667 | 7.887 |
| 0.642361111111111 | 7.887 |
| 0.6430555555555556 | 7.887 |
| 0.6437499999999999 | 7.887 |
| 0.6444444444444445 | 7.887 |
| 0.6451388888888888 | 7.887 |
| 0.6458333333333334 | 7.887 |
| 0.6465277777777778 | 7.887 |
| 0.6472222222222223 | 7.887 |
| 0.6479166666666667 | 7.887 |
| 0.6486111111111111 | 7.887 |
| 0.6493055555555556 | 7.887 |
| 0.65 | 7.887 |
| 0.6506944444444445 | 7.887 |
| 0.6513888888888889 | 7.887 |
| 0.6520833333333333 | 7.887 |
| 0.6527777777777778 | 7.887 |
| 0.6534722222222222 | 7.887 |
| 0.6541666666666667 | 7.887 |
| 0.6548611111111111 | 3.525 |
| 0.6555555555555556 | 3.525 |
| 0.65625 | 3.525 |
| 0.6569444444444444 | 3.525 |
| 0.6576388888888889 | 3.525 |
| 0.6583333333333333 | 3.525 |
| 0.6590277777777778 | 3.525 |
| 0.6597222222222222 | 3.525 |
| 0.6604166666666667 | 3.525 |
| 0.6611111111111111 | 3.525 |
| 0.6618055555555555 | 3.525 |
| 0.6625 | 3.525 |
| 0.6631944444444444 | 3.525 |
| 0.6638888888888889 | 3.525 |
| 0.6645833333333333 | 3.525 |
| 0.6652777777777777 | 3.525 |
| 0.6659722222222222 | 3.525 |
| 0.6666666666666666 | 3.525 |
| 0.6673611111111111 | 3.525 |
| 0.6680555555555556 | 3.525 |
| 0.6687500000000001 | 3.525 |
| 0.6694444444444444 | 3.525 |
| 0.6701388888888888 | 3.525 |
| 0.6708333333333334 | 3.525 |
| 0.6715277777777778 | 3.525 |
| 0.6722222222222222 | 3.525 |
| 0.6729166666666666 | 3.525 |
| 0.6736111111111112 | 3.525 |
| 0.6743055555555556 | 3.525 |
| 0.6749999999999999 | 3.525 |
| 0.6756944444444444 | 3.525 |
| 0.6763888888888889 | 3.525 |
| 0.6770833333333334 | 3.525 |
| 0.6777777777777777 | 3.525 |
| 0.6784722222222223 | 0 |
| 0.6791666666666667 | 0 |
| 0.6798611111111111 | 3.525 |
| 0.6805555555555555 | 0 |
| 0.68125 | 0 |
| 0.6819444444444445 | 0 |
| 0.6826388888888889 | 0 |
| 0.6833333333333332 | 0 |
| 0.6840277777777778 | 0 |
| 0.6847222222222222 | 0 |
| 0.6854166666666667 | 0 |
| 0.686111111111111 | 0 |
| 0.6868055555555556 | 0 |
| 0.6875 | 0 |
| 0.6881944444444444 | 0 |
| 0.688888888888889 | 0 |
| 0.6895833333333333 | 0 |
| 0.6902777777777778 | 0 |
| 0.6909722222222222 | 0 |
| 0.6916666666666668 | 0 |
| 0.6923611111111111 | 0 |
| 0.6930555555555555 | 0 |
| 0.69375 | 0 |
| 0.6944444444444445 | 0 |
| 0.6951388888888889 | 0 |
| 0.6958333333333333 | 0 |
| 0.6965277777777777 | 0 |
| 0.6972222222222223 | 0 |
| 0.6979166666666666 | 0 |
| 0.6986111111111111 | 0 |
| 0.6993055555555556 | 0 |
| 0.7000000000000001 | 0 |
| 0.7006944444444444 | 0 |
| 0.7013888888888888 | 0 |
| 0.7020833333333334 | 0 |
| 0.7027777777777778 | 0 |
| 0.7034722222222222 | 0 |
| 0.7041666666666666 | 0 |
| 0.7048611111111112 | 0 |
| 0.7055555555555556 | 0 |
| 0.7062499999999999 | 0 |
| 0.7069444444444444 | 0 |
| 0.7076388888888889 | 0 |
| 0.7083333333333334 | 0 |
| 0.7090277777777777 | 0 |
| 0.7097222222222223 | 0 |
| 0.7104166666666667 | 0 |
| 0.7111111111111111 | 0 |
| 0.7118055555555555 | 0 |
| 0.7125 | 0 |
| 0.7131944444444445 | 0 |
| 0.7138888888888889 | 0 |
| 0.7145833333333332 | 0 |
| 0.7152777777777778 | 0 |
| 0.7159722222222222 | 0 |
| 0.7166666666666667 | 0 |
| 0.717361111111111 | 0 |
| 0.7180555555555556 | 0 |
| 0.71875 | 0 |
| 0.7194444444444444 | 0 |
| 0.720138888888889 | 0 |
| 0.7208333333333333 | 0 |
| 0.7215277777777778 | 0 |
| 0.7222222222222222 | 0 |
| 0.7229166666666668 | 0 |
| 0.7236111111111111 | 0 |
| 0.7243055555555555 | 0 |
| 0.725 | 0 |
| 0.7256944444444445 | 0 |
| 0.7263888888888889 | 0 |
| 0.7270833333333333 | 0 |
| 0.7277777777777777 | 0 |
| 0.7284722222222223 | 0 |
| 0.7291666666666666 | 0 |
| 0.7298611111111111 | 0 |
| 0.7305555555555556 | 0 |
| 0.7312500000000001 | 0 |
| 0.7319444444444444 | 0 |
| 0.7326388888888888 | 0 |
| 0.7333333333333334 | 0 |
| 0.7340277777777778 | 0 |
| 0.7347222222222222 | 0 |
| 0.7354166666666666 | 0 |
| 0.7361111111111112 | 0 |
| 0.7368055555555556 | 0 |
| 0.7374999999999999 | 0 |
| 0.7381944444444444 | 0 |
| 0.7388888888888889 | 0 |
| 0.7395833333333334 | 0 |
| 0.7402777777777777 | 0 |
| 0.7409722222222223 | 0 |
| 0.7416666666666667 | 0 |
| 0.7423611111111111 | 0 |
| 0.7430555555555555 | 0 |
| 0.74375 | 0 |
| 0.7444444444444445 | 0 |
| 0.7451388888888889 | 0 |
| 0.7458333333333332 | 0 |
| 0.7465277777777778 | 0 |
| 0.7472222222222222 | 0 |
| 0.7479166666666667 | 0 |
| 0.748611111111111 | 0 |
| 0.7493055555555556 | 0 |
| 0.75 | 0 |
| 0.7506944444444444 | 0 |
| 0.751388888888889 | 0 |
| 0.7520833333333333 | 0 |
| 0.7527777777777778 | 0 |
| 0.7534722222222222 | 0 |
| 0.7541666666666668 | 0 |
| 0.7548611111111111 | 0 |
| 0.7555555555555555 | 0 |
| 0.75625 | 0 |
| 0.7569444444444445 | 0 |
| 0.7576388888888889 | 0 |
| 0.7583333333333333 | 0 |
| 0.7590277777777777 | 0 |
| 0.7597222222222223 | 0 |
| 0.7604166666666666 | 0 |
| 0.7611111111111111 | 0 |
| 0.7618055555555556 | 0 |
| 0.7625000000000001 | 0 |
| 0.7631944444444444 | 0 |
| 0.7638888888888888 | 0 |
| 0.7645833333333334 | 0 |
| 0.7652777777777778 | 0 |
| 0.7659722222222222 | 0 |
| 0.7666666666666666 | 0 |
| 0.7673611111111112 | 0 |
| 0.7680555555555556 | 0 |
| 0.7687499999999999 | 0 |
| 0.7694444444444444 | 0 |
| 0.7701388888888889 | 0 |
| 0.7708333333333334 | 0 |
| 0.7715277777777777 | 0 |
| 0.7722222222222223 | 0 |
| 0.7729166666666667 | 0 |
| 0.7736111111111111 | 0 |
| 0.7743055555555555 | 0 |
| 0.775 | 0 |
| 0.7756944444444445 | 0 |
| 0.7763888888888889 | 0 |
| 0.7770833333333332 | 0 |
| 0.7777777777777778 | 0 |
| 0.7784722222222222 | 0 |
| 0.7791666666666667 | 0 |
| 0.779861111111111 | 0 |
| 0.7805555555555556 | 0 |
| 0.78125 | 0 |
| 0.7819444444444444 | 0 |
| 0.782638888888889 | 0 |
| 0.7833333333333333 | 0 |
| 0.7840277777777778 | 0 |
| 0.7847222222222222 | 0 |
| 0.7854166666666668 | 0 |
| 0.7861111111111111 | 0 |
| 0.7868055555555555 | 0 |
| 0.7875 | 0 |
| 0.7881944444444445 | 0 |
| 0.7888888888888889 | 0 |
| 0.7895833333333333 | 0 |
| 0.7902777777777777 | 0 |
| 0.7909722222222223 | 0 |
| 0.7916666666666666 | 0 |
| 0.7923611111111111 | 0 |
| 0.7930555555555556 | 0 |
| 0.7937500000000001 | 0 |
| 0.7944444444444444 | 0 |
| 0.7951388888888888 | 0 |
| 0.7958333333333334 | 0 |
| 0.7965277777777778 | 0 |
| 0.7972222222222222 | 0 |
| 0.7979166666666666 | 0 |
| 0.7986111111111112 | 0 |
| 0.7993055555555556 | 0 |
| 0.7999999999999999 | 0 |
| 0.8006944444444444 | 0 |
| 0.8013888888888889 | 0 |
| 0.8020833333333334 | 0 |
| 0.8027777777777777 | 0 |
| 0.8034722222222223 | 0 |
| 0.8041666666666667 | 0 |
| 0.8048611111111111 | 0 |
| 0.8055555555555555 | 0 |
| 0.80625 | 0 |
| 0.8069444444444445 | 0 |
| 0.8076388888888889 | 0 |
| 0.8083333333333332 | 0 |
| 0.8090277777777778 | 0 |
| 0.8097222222222222 | 0 |
| 0.8104166666666667 | 0 |
| 0.811111111111111 | 0 |
| 0.8118055555555556 | 0 |
| 0.8125 | 0 |
| 0.8131944444444444 | 0 |
| 0.813888888888889 | 0 |
| 0.8145833333333333 | 0 |
| 0.8152777777777778 | 0 |
| 0.8159722222222222 | 0 |
| 0.8166666666666668 | 0 |
| 0.8173611111111111 | 0 |
| 0.8180555555555555 | 0 |
| 0.81875 | 0 |
| 0.8194444444444445 | 0 |
| 0.8201388888888889 | 0 |
| 0.8208333333333333 | 0 |
| 0.8215277777777777 | 0 |
| 0.8222222222222223 | 0 |
| 0.8229166666666666 | 0 |
| 0.8236111111111111 | 0 |
| 0.8243055555555556 | 0 |
| 0.8250000000000001 | 0 |
| 0.8256944444444444 | 0 |
| 0.8263888888888888 | 0 |
| 0.8270833333333334 | 0 |
| 0.8277777777777778 | 0 |
| 0.8284722222222222 | 0 |
| 0.8291666666666666 | 0 |
| 0.8298611111111112 | 0 |
| 0.8305555555555556 | 0 |
| 0.8312499999999999 | 0 |
| 0.8319444444444444 | 0 |
| 0.8326388888888889 | 0 |
| 0.8333333333333334 | 0 |
| 0.8340277777777777 | 0 |
| 0.8347222222222223 | 0 |
| 0.8354166666666667 | 0 |
| 0.8361111111111111 | 0 |
| 0.8368055555555555 | 0 |
| 0.8375 | 0 |
| 0.8381944444444445 | 0 |
| 0.8388888888888889 | 0 |
| 0.8395833333333332 | 0 |
| 0.8402777777777778 | 0 |
| 0.8409722222222222 | 0 |
| 0.8416666666666667 | 0 |
| 0.842361111111111 | 0 |
| 0.8430555555555556 | 0 |
| 0.84375 | 0 |
| 0.8444444444444444 | 0 |
| 0.845138888888889 | 0 |
| 0.8458333333333333 | 0 |
| 0.8465277777777778 | 0 |
| 0.8472222222222222 | 0 |
| 0.8479166666666668 | 0 |
| 0.8486111111111111 | 0 |
| 0.8493055555555555 | 0 |
| 0.85 | 0 |
| 0.8506944444444445 | 0 |
| 0.8513888888888889 | 0 |
| 0.8520833333333333 | 0 |
| 0.8527777777777777 | 0 |
| 0.8534722222222223 | 0 |
| 0.8541666666666666 | 0 |
| 0.8548611111111111 | 0 |
| 0.8555555555555556 | 0 |
| 0.8562500000000001 | 0 |
| 0.8569444444444444 | 0 |
| 0.8576388888888888 | 0 |
| 0.8583333333333334 | 0 |
| 0.8590277777777778 | 0 |
| 0.8597222222222222 | 0 |
| 0.8604166666666666 | 0 |
| 0.8611111111111112 | 0 |
| 0.8618055555555556 | 0 |
| 0.8624999999999999 | 0 |
| 0.8631944444444444 | 0 |
| 0.8638888888888889 | 0 |
| 0.8645833333333334 | 0 |
| 0.8652777777777777 | 0 |
| 0.8659722222222223 | 0 |
| 0.8666666666666667 | 0 |
| 0.8673611111111111 | 0 |
| 0.8680555555555555 | 0 |
| 0.86875 | 0 |
| 0.8694444444444445 | 0 |
| 0.8701388888888889 | 0 |
| 0.8708333333333332 | 0 |
| 0.8715277777777778 | 0 |
| 0.8722222222222222 | 0 |
| 0.8729166666666667 | 0 |
| 0.873611111111111 | 0 |
| 0.8743055555555556 | 0 |
| 0.875 | 0 |
| 0.8756944444444444 | 0 |
| 0.876388888888889 | 0 |
| 0.8770833333333333 | 0 |
| 0.8777777777777778 | 0 |
| 0.8784722222222222 | 0 |
| 0.8791666666666668 | 0 |
| 0.8798611111111111 | 0 |
| 0.8805555555555555 | 0 |
| 0.88125 | 0 |
| 0.8819444444444445 | 0 |
| 0.8826388888888889 | 0 |
| 0.8833333333333333 | 0 |
| 0.8840277777777777 | 0 |
| 0.8847222222222223 | 0 |
| 0.8854166666666666 | 0 |
| 0.8861111111111111 | 0 |
| 0.8868055555555556 | 0 |
| 0.8875000000000001 | 0 |
| 0.8881944444444444 | 0 |
| 0.8888888888888888 | 0 |
| 0.8895833333333334 | 0 |
| 0.8902777777777778 | 0 |
| 0.8909722222222222 | 0 |
| 0.8916666666666666 | 0 |
| 0.8923611111111112 | 0 |
| 0.8930555555555556 | 0 |
| 0.8937499999999999 | 0 |
| 0.8944444444444444 | 0 |
| 0.8951388888888889 | 0 |
| 0.8958333333333334 | 0 |
| 0.8965277777777777 | 0 |
| 0.8972222222222223 | 0 |
| 0.8979166666666667 | 0 |
| 0.8986111111111111 | 0 |
| 0.8993055555555555 | 0 |
| 0.9 | 0 |
| 0.9006944444444445 | 0 |
| 0.9013888888888889 | 0 |
| 0.9020833333333332 | 0 |
| 0.9027777777777778 | 0 |
| 0.9034722222222222 | 0 |
| 0.9041666666666667 | 0 |
| 0.904861111111111 | 0 |
| 0.9055555555555556 | 0 |
| 0.90625 | 0 |
| 0.9069444444444444 | 0 |
| 0.907638888888889 | 0 |
| 0.9083333333333333 | 0 |
| 0.9090277777777778 | 0 |
| 0.9097222222222222 | 0 |
| 0.9104166666666668 | 0 |
| 0.9111111111111111 | 0 |
| 0.9118055555555555 | 0 |
| 0.9125 | 0 |
| 0.9131944444444445 | 0 |
| 0.9138888888888889 | 0 |
| 0.9145833333333333 | 0 |
| 0.9152777777777777 | 0 |
| 0.9159722222222223 | 0 |
| 0.9166666666666666 | 0 |
| 0.9173611111111111 | 0 |
| 0.9180555555555556 | 0 |
| 0.9187500000000001 | 0 |
| 0.9194444444444444 | 0 |
| 0.9201388888888888 | 0 |
| 0.9208333333333334 | 0 |
| 0.9215277777777778 | 0 |
| 0.9222222222222222 | 0 |
| 0.9229166666666666 | 0 |
| 0.9236111111111112 | 0 |
| 0.9243055555555556 | 0 |
| 0.9249999999999999 | 0 |
| 0.9256944444444444 | 0 |
| 0.9263888888888889 | 0 |
| 0.9270833333333334 | 0 |
| 0.9277777777777777 | 0 |
| 0.9284722222222223 | 0 |
| 0.9291666666666667 | 0 |
| 0.9298611111111111 | 0 |
| 0.9305555555555555 | 0 |
| 0.93125 | 0 |
| 0.9319444444444445 | 0 |
| 0.9326388888888889 | 0 |
| 0.9333333333333332 | 0 |
| 0.9340277777777778 | 0 |
| 0.9347222222222222 | 0 |
| 0.9354166666666667 | 0 |
| 0.936111111111111 | 0 |
| 0.9368055555555556 | 0 |
| 0.9375 | 0 |
| 0.9381944444444444 | 0 |
| 0.938888888888889 | 0 |
| 0.9395833333333333 | 0 |
| 0.9402777777777778 | 0 |
| 0.9409722222222222 | 0 |
| 0.9416666666666668 | 0 |
| 0.9423611111111111 | 0 |
| 0.9430555555555555 | 0 |
| 0.94375 | 0 |
| 0.9444444444444445 | 0 |
| 0.9451388888888889 | 0 |
| 0.9458333333333333 | 0 |
| 0.9465277777777777 | 0 |
| 0.9472222222222223 | 0 |
| 0.9479166666666666 | 0 |
| 0.9486111111111111 | 0 |
| 0.9493055555555556 | 0 |
| 0.9500000000000001 | 0 |
| 0.9506944444444444 | 0 |
| 0.9513888888888888 | 0 |
| 0.9520833333333334 | 0 |
| 0.9527777777777778 | 0 |
| 0.9534722222222222 | 0 |
| 0.9541666666666666 | 0 |
| 0.9548611111111112 | 0 |
| 0.9555555555555556 | 0 |
| 0.9562499999999999 | 0 |
| 0.9569444444444444 | 0 |
| 0.9576388888888889 | 0 |
| 0.9583333333333334 | 0 |
| 0.9590277777777777 | 0 |
| 0.9597222222222223 | 0 |
| 0.9604166666666667 | 0 |
| 0.9611111111111111 | 0 |
| 0.9618055555555555 | 0 |
| 0.9625 | 0 |
| 0.9631944444444445 | 0 |
| 0.9638888888888889 | 0 |
| 0.9645833333333332 | 0 |
| 0.9652777777777778 | 0 |
| 0.9659722222222222 | 0 |
| 0.9666666666666667 | 0 |
| 0.967361111111111 | 0 |
| 0.9680555555555556 | 0 |
| 0.96875 | 0 |
| 0.9694444444444444 | 0 |
| 0.970138888888889 | 0 |
| 0.9708333333333333 | 0 |
| 0.9715277777777778 | 0 |
| 0.9722222222222222 | 0 |
| 0.9729166666666668 | 0 |
| 0.9736111111111111 | 0 |
| 0.9743055555555555 | 0 |
| 0.975 | 0 |
| 0.9756944444444445 | 0 |
| 0.9763888888888889 | 0 |
| 0.9770833333333333 | 0 |
| 0.9777777777777777 | 0 |
| 0.9784722222222223 | 0 |
| 0.9791666666666666 | 0 |
| 0.9798611111111111 | 0 |
| 0.9805555555555556 | 0 |
| 0.9812500000000001 | 0 |
| 0.9819444444444444 | 0 |
| 0.9826388888888888 | 0 |
| 0.9833333333333334 | 0 |
| 0.9840277777777778 | 0 |
| 0.9847222222222222 | 0 |
| 0.9854166666666666 | 0 |
| 0.9861111111111112 | 0 |
| 0.9868055555555556 | 0 |
| 0.9874999999999999 | 0 |
| 0.9881944444444444 | 0 |
| 0.9888888888888889 | 0 |
| 0.9895833333333334 | 0 |
| 0.9902777777777777 | 0 |
| 0.9909722222222223 | 0 |
| 0.9916666666666667 | 0 |
| 0.9923611111111111 | 0 |
| 0.9930555555555555 | 0 |
| 0.99375 | 0 |
| 0.9944444444444445 | 0 |
| 0.9951388888888889 | 0 |
| 0.9958333333333332 | 0 |
| 0.9965277777777778 | 0 |
| 0.9972222222222222 | 0 |
| 0.9979166666666667 | 0 |
| 0.998611111111111 | 0 |
| 0.9993055555555556 | 0 |